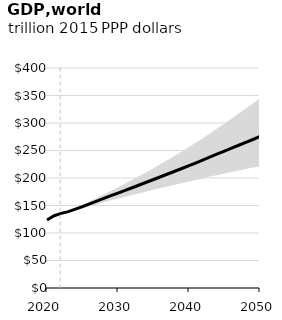
| Category | Series 6 |
|---|---|
| 2020.0 | 123687.473 |
| 2021.0 | 131383.879 |
| 2022.0 | 135646.549 |
| 2023.0 | 138770.701 |
| 2024.0 | 143314.675 |
| 2025.0 | 148120.786 |
| 2026.0 | 153004.877 |
| 2027.0 | 157935.631 |
| 2028.0 | 162923.446 |
| 2029.0 | 167798.174 |
| 2030.0 | 172547.488 |
| 2031.0 | 177341.583 |
| 2032.0 | 182265.888 |
| 2033.0 | 187277.642 |
| 2034.0 | 192292.746 |
| 2035.0 | 197274.167 |
| 2036.0 | 202262.728 |
| 2037.0 | 207256.284 |
| 2038.0 | 212259.479 |
| 2039.0 | 217284.778 |
| 2040.0 | 222455.673 |
| 2041.0 | 227694.739 |
| 2042.0 | 232986.337 |
| 2043.0 | 238325.775 |
| 2044.0 | 243677.734 |
| 2045.0 | 248994.529 |
| 2046.0 | 254263.452 |
| 2047.0 | 259527.135 |
| 2048.0 | 264781.801 |
| 2049.0 | 270023.975 |
| 2050.0 | 275354.579 |